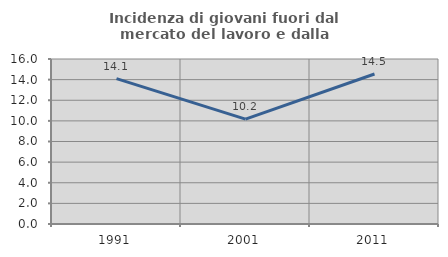
| Category | Incidenza di giovani fuori dal mercato del lavoro e dalla formazione  |
|---|---|
| 1991.0 | 14.103 |
| 2001.0 | 10.169 |
| 2011.0 | 14.545 |